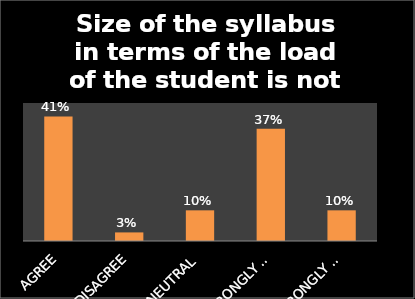
| Category | Series 0 |
|---|---|
| AGREE | 0.406 |
| DISAGREE | 0.028 |
| NEUTRAL | 0.1 |
| STRONGLY AGREE | 0.366 |
| STRONGLY DISAGREE | 0.1 |